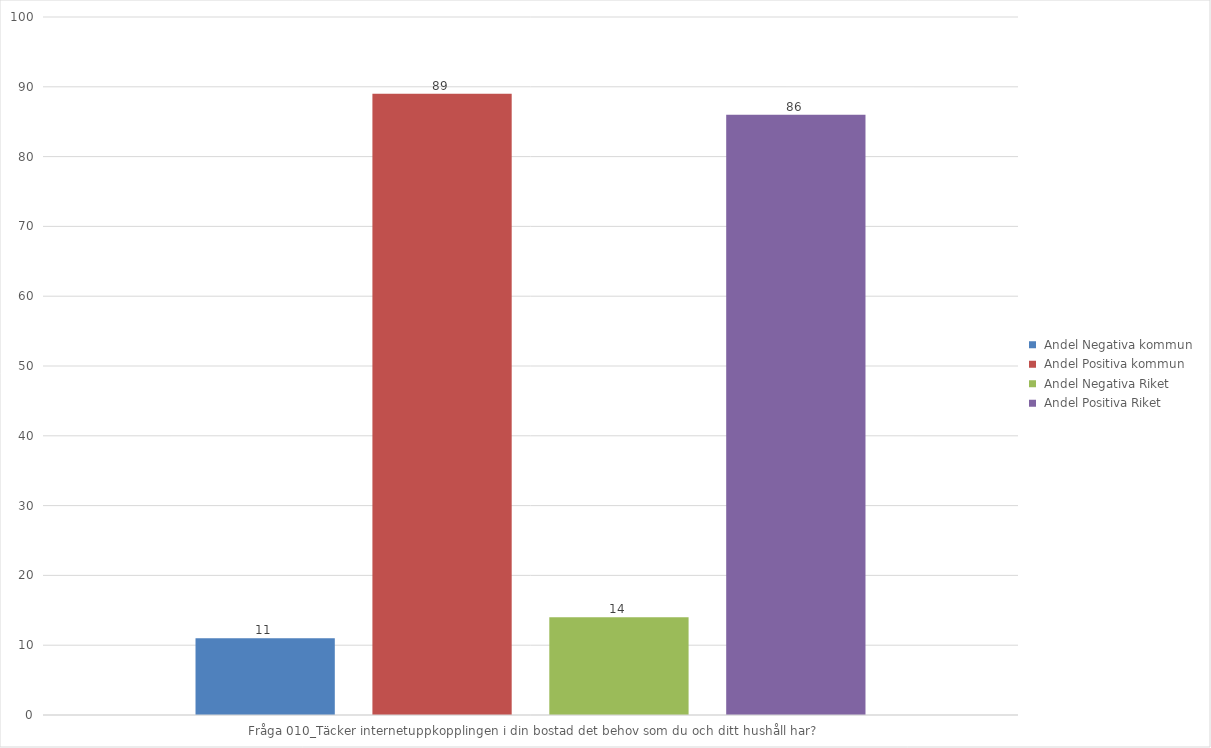
| Category |  Andel Negativa kommun |  Andel Positiva kommun |  Andel Negativa Riket |  Andel Positiva Riket |
|---|---|---|---|---|
| Fråga 010_Täcker internetuppkopplingen i din bostad det behov som du och ditt hushåll har? | 11 | 89 | 14 | 86 |